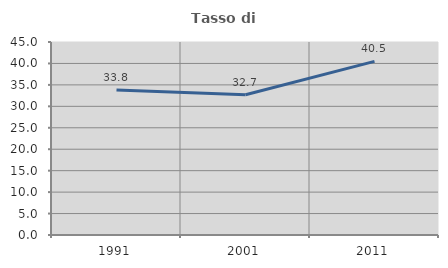
| Category | Tasso di occupazione   |
|---|---|
| 1991.0 | 33.78 |
| 2001.0 | 32.704 |
| 2011.0 | 40.492 |